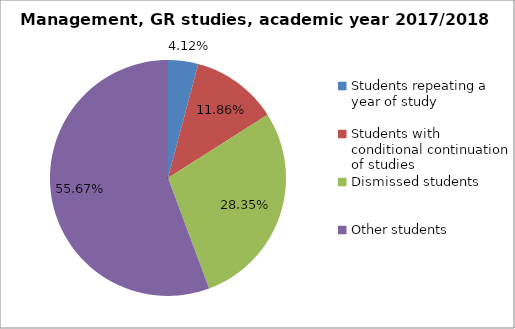
| Category | Series 0 |
|---|---|
| Students repeating a year of study | 8 |
| Students with conditional continuation of studies | 23 |
| Dismissed students | 55 |
| Other students | 108 |